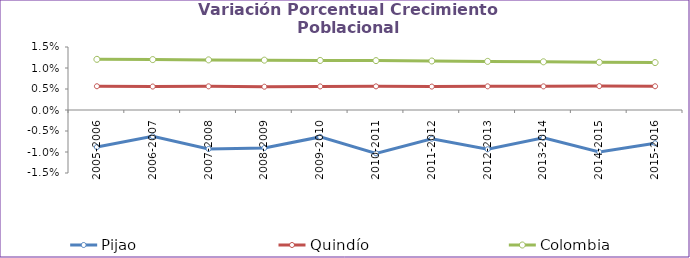
| Category | Pijao | Quindío | Colombia |
|---|---|---|---|
| 2005-2006 | -0.009 | 0.006 | 0.012 |
| 2006-2007 | -0.006 | 0.006 | 0.012 |
| 2007-2008 | -0.009 | 0.006 | 0.012 |
| 2008-2009 | -0.009 | 0.006 | 0.012 |
| 2009-2010 | -0.006 | 0.006 | 0.012 |
| 2010-2011 | -0.01 | 0.006 | 0.012 |
| 2011-2012 | -0.007 | 0.006 | 0.012 |
| 2012-2013 | -0.009 | 0.006 | 0.012 |
| 2013-2014 | -0.007 | 0.006 | 0.011 |
| 2014-2015 | -0.01 | 0.006 | 0.011 |
| 2015-2016 | -0.008 | 0.006 | 0.011 |